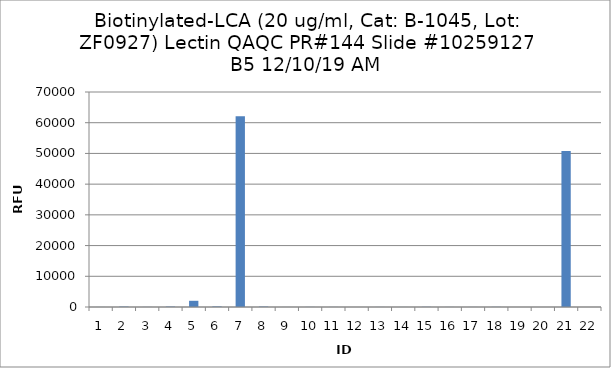
| Category | Series 0 |
|---|---|
| 0 | 15.75 |
| 1 | 127.5 |
| 2 | 31.75 |
| 3 | 136.5 |
| 4 | 2019.25 |
| 5 | 179.5 |
| 6 | 62067.25 |
| 7 | 136 |
| 8 | 12.75 |
| 9 | 32.5 |
| 10 | 22.25 |
| 11 | -65.75 |
| 12 | 21 |
| 13 | 16.5 |
| 14 | 55.5 |
| 15 | 20.5 |
| 16 | 20 |
| 17 | 45.25 |
| 18 | 1.5 |
| 19 | 5.75 |
| 20 | 50806.75 |
| 21 | -1.5 |